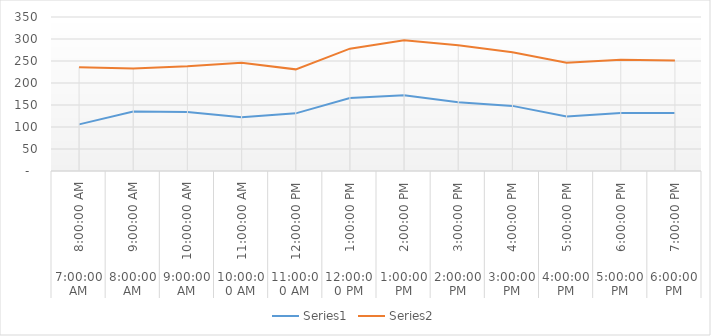
| Category | Series 0 | Series 1 |
|---|---|---|
| 0 | 106 | 130 |
| 1 | 135 | 98 |
| 2 | 134 | 104 |
| 3 | 122 | 124 |
| 4 | 131 | 100 |
| 5 | 166 | 112 |
| 6 | 172 | 125 |
| 7 | 156 | 130 |
| 8 | 148 | 122 |
| 9 | 124 | 122 |
| 10 | 132 | 121 |
| 11 | 132 | 119 |